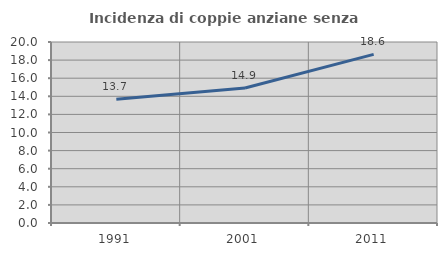
| Category | Incidenza di coppie anziane senza figli  |
|---|---|
| 1991.0 | 13.669 |
| 2001.0 | 14.914 |
| 2011.0 | 18.635 |